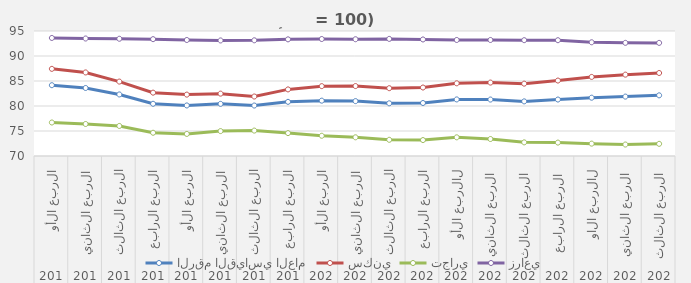
| Category | الرقم القياسي العام | سكني | تجاري | زراعي |
|---|---|---|---|---|
| 0 | 84.16 | 87.43 | 76.7 | 93.61 |
| 1 | 83.603 | 86.713 | 76.403 | 93.5 |
| 2 | 82.31 | 84.883 | 76.01 | 93.45 |
| 3 | 80.443 | 82.67 | 74.65 | 93.37 |
| 4 | 80.11 | 82.277 | 74.417 | 93.203 |
| 5 | 80.427 | 82.473 | 74.983 | 93.11 |
| 6 | 80.093 | 81.9 | 75.083 | 93.14 |
| 7 | 80.833 | 83.32 | 74.577 | 93.33 |
| 8 | 81.07 | 83.973 | 74.047 | 93.397 |
| 9 | 80.977 | 83.99 | 73.74 | 93.353 |
| 10 | 80.538 | 83.562 | 73.242 | 93.424 |
| 11 | 80.6 | 83.696 | 73.187 | 93.307 |
| 12 | 81.315 | 84.54 | 73.736 | 93.206 |
| 13 | 81.291 | 84.687 | 73.398 | 93.204 |
| 14 | 80.925 | 84.473 | 72.728 | 93.164 |
| 15 | 81.295 | 85.089 | 72.682 | 93.157 |
| 16 | 81.662 | 85.816 | 72.474 | 92.745 |
| 17 | 81.879 | 86.272 | 72.295 | 92.633 |
| 18 | 82.132 | 86.603 | 72.433 | 92.625 |